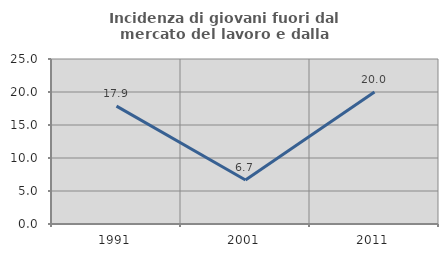
| Category | Incidenza di giovani fuori dal mercato del lavoro e dalla formazione  |
|---|---|
| 1991.0 | 17.857 |
| 2001.0 | 6.667 |
| 2011.0 | 20 |